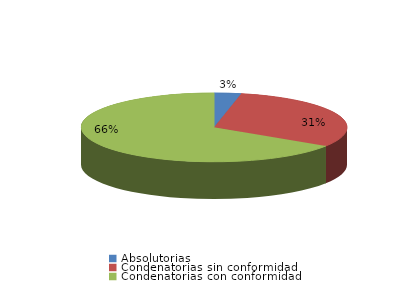
| Category | Series 0 |
|---|---|
| Absolutorias | 7 |
| Condenatorias sin conformidad | 66 |
| Condenatorias con conformidad | 141 |